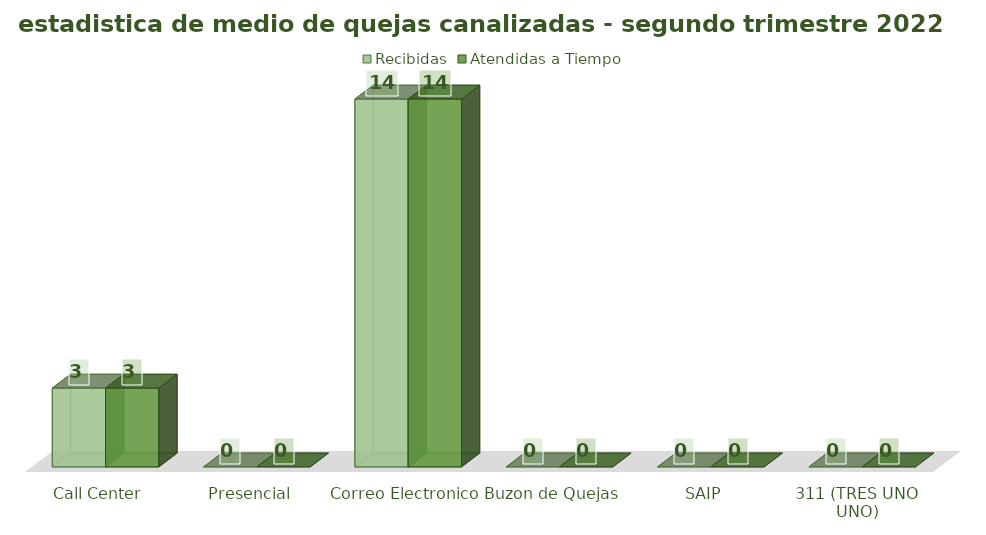
| Category | Recibidas | Atendidas a Tiempo |
|---|---|---|
| Call Center | 3 | 3 |
| Presencial | 0 | 0 |
| Correo Electronico  | 14 | 14 |
| Buzon de Quejas | 0 | 0 |
| SAIP | 0 | 0 |
| 311 (TRES UNO UNO) | 0 | 0 |